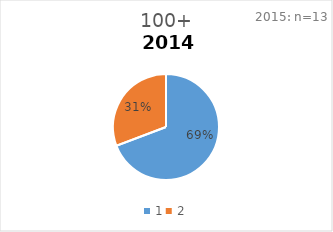
| Category | 100+ |
|---|---|
| 0 | 0.692 |
| 1 | 0.308 |